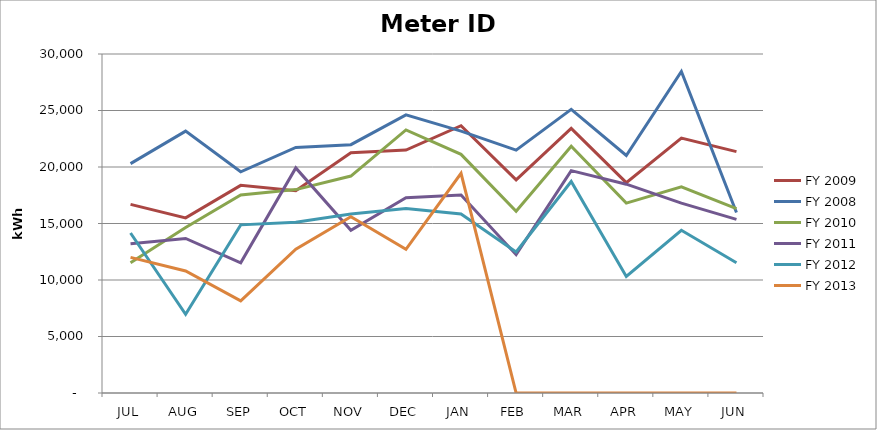
| Category | FY 2009 | FY 2008 | FY 2010 | FY 2011 | FY 2012 | FY 2013 |
|---|---|---|---|---|---|---|
| JUL | 16696 | 20296 | 11520 | 13200 | 14160 | 12000 |
| AUG | 15496 | 23176 | 14640 | 13680 | 6960 | 10800 |
| SEP | 18376 | 19576 | 17520 | 11520 | 14880 | 8160 |
| OCT | 17896 | 21736 | 18000 | 19920 | 15120 | 12720 |
| NOV | 21256 | 21976 | 19200 | 14400 | 15840 | 15600 |
| DEC | 21496 | 24616 | 23280 | 17280 | 16320 | 12720 |
| JAN | 23656 | 23176 | 21120 | 17520 | 15840 | 19440 |
| FEB | 18856 | 21496 | 16080 | 12240 | 12480 | 0 |
| MAR | 23416 | 25096 | 21840 | 19680 | 18720 | 0 |
| APR | 18616 | 21016 | 16800 | 18480 | 10320 | 0 |
| MAY | 22560 | 28456 | 18240 | 16800 | 14400 | 0 |
| JUN | 21360 | 15976 | 16320 | 15360 | 11520 | 0 |